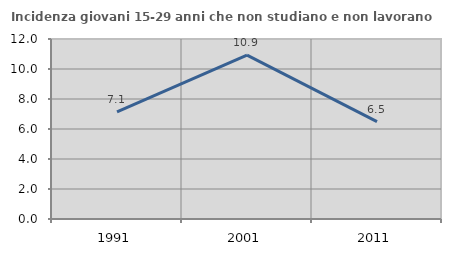
| Category | Incidenza giovani 15-29 anni che non studiano e non lavorano  |
|---|---|
| 1991.0 | 7.143 |
| 2001.0 | 10.924 |
| 2011.0 | 6.494 |